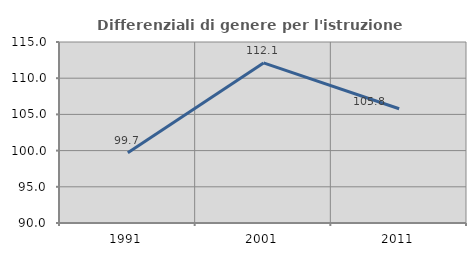
| Category | Differenziali di genere per l'istruzione superiore |
|---|---|
| 1991.0 | 99.697 |
| 2001.0 | 112.113 |
| 2011.0 | 105.782 |